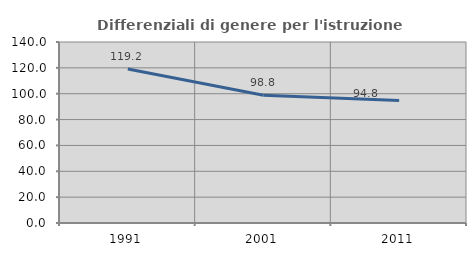
| Category | Differenziali di genere per l'istruzione superiore |
|---|---|
| 1991.0 | 119.175 |
| 2001.0 | 98.825 |
| 2011.0 | 94.821 |